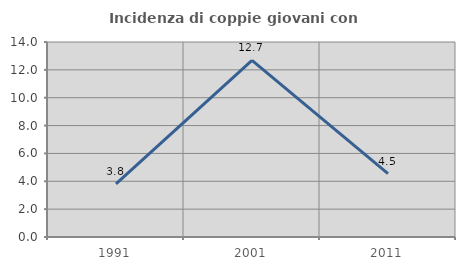
| Category | Incidenza di coppie giovani con figli |
|---|---|
| 1991.0 | 3.817 |
| 2001.0 | 12.676 |
| 2011.0 | 4.545 |